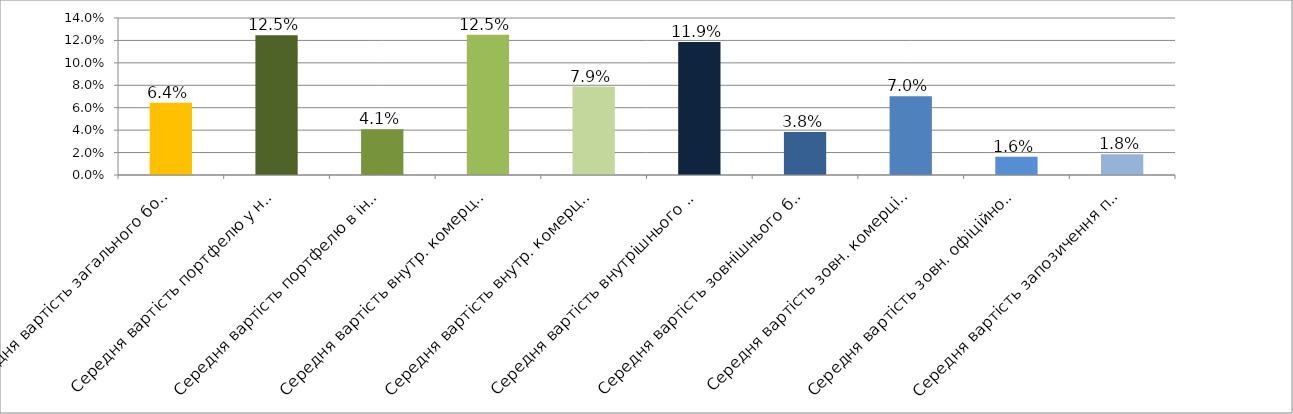
| Category | Series 0 |
|---|---|
| Середня вартість загального боргового портфелю | 0.064 |
| Середня вартість портфелю у нац.валюті | 0.125 |
| Середня вартість портфелю в іноземній валюті | 0.041 |
| Середня вартість внутр. комерційного портфелю в нац.валюті | 0.125 |
| Середня вартість внутр. комерційного портфелю в іноземній валюті | 0.079 |
| Середня вартість внутрішнього боргового портфелю | 0.119 |
| Середня вартість зовнішнього боргового портфелю | 0.038 |
| Середня вартість зовн. комерційного портфелю в іноземній валюті | 0.07 |
| Середня вартість зовн. офіційного портфелю в іноземній валюті | 0.016 |
| Середня вартість запозичення під держгарантії США в іноземній валюті | 0.018 |